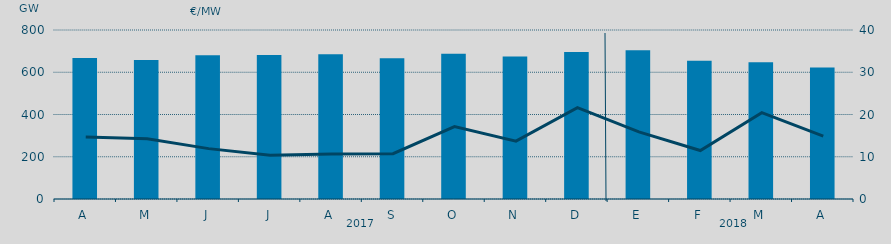
| Category | Energia (MWh) a subir |
|---|---|
| A | 667.793 |
| M | 657.634 |
| J | 680.754 |
| J | 681.722 |
| A | 685.083 |
| S | 666.501 |
| O | 686.996 |
| N | 674.335 |
| D | 695.754 |
| E | 703.828 |
| F | 654.951 |
| M | 647.688 |
| A | 622.901 |